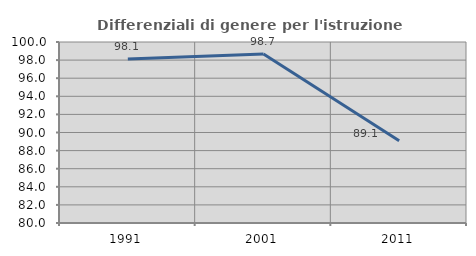
| Category | Differenziali di genere per l'istruzione superiore |
|---|---|
| 1991.0 | 98.124 |
| 2001.0 | 98.685 |
| 2011.0 | 89.081 |